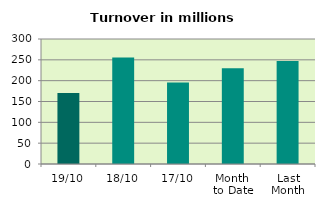
| Category | Series 0 |
|---|---|
| 19/10 | 170.679 |
| 18/10 | 255.735 |
| 17/10 | 195.686 |
| Month 
to Date | 229.924 |
| Last
Month | 247.353 |